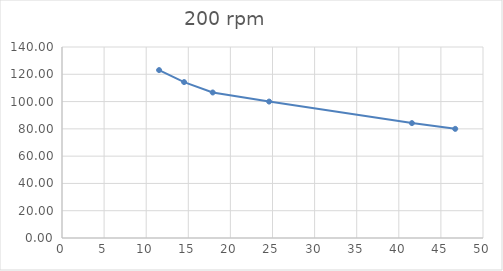
| Category | Series 0 |
|---|---|
| 11.529999999999998 | 123.077 |
| 14.5 | 114.286 |
| 17.9 | 106.667 |
| 24.6 | 100 |
| 41.559999999999995 | 84.211 |
| 46.7 | 80 |